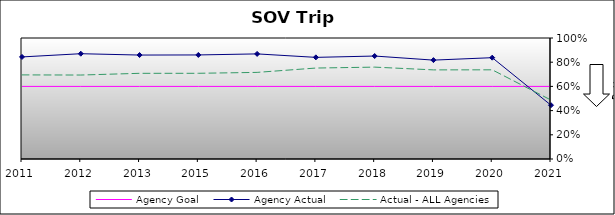
| Category | Agency Goal | Agency Actual | Actual - ALL Agencies |
|---|---|---|---|
| 2011.0 | 0.6 | 0.844 | 0.695 |
| 2012.0 | 0.6 | 0.87 | 0.694 |
| 2013.0 | 0.6 | 0.859 | 0.708 |
| 2015.0 | 0.6 | 0.86 | 0.708 |
| 2016.0 | 0.6 | 0.869 | 0.716 |
| 2017.0 | 0.6 | 0.84 | 0.752 |
| 2018.0 | 0.6 | 0.851 | 0.759 |
| 2019.0 | 0.6 | 0.817 | 0.736 |
| 2020.0 | 0.6 | 0.837 | 0.737 |
| 2021.0 | 0.6 | 0.444 | 0.487 |